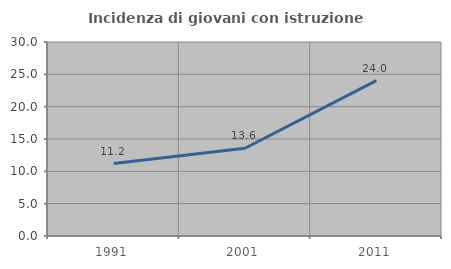
| Category | Incidenza di giovani con istruzione universitaria |
|---|---|
| 1991.0 | 11.194 |
| 2001.0 | 13.573 |
| 2011.0 | 24.021 |